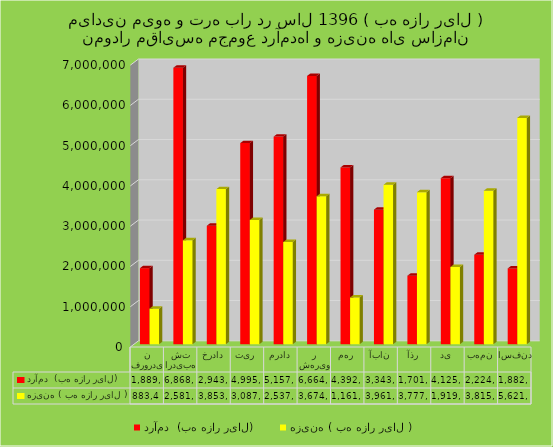
| Category | درآمد  (به هزار ریال) | هزینه ( به هزار ریال ) |
|---|---|---|
| فروردین | 1889557 | 883456 |
| اردیبهشت | 6868051 | 2581639 |
| خرداد | 2943501 | 3853169 |
| تیر | 4995845 | 3087149 |
| مرداد | 5157309 | 2537824 |
| شهریور | 6664214 | 3674936 |
| مهر | 4392251 | 1161844 |
| آبان | 3343440 | 3961326 |
| آذر | 1701299 | 3777634 |
| دی | 4125389 | 1919633 |
| بهمن | 2224564 | 3815121 |
| اسفند | 1882662 | 5621878 |